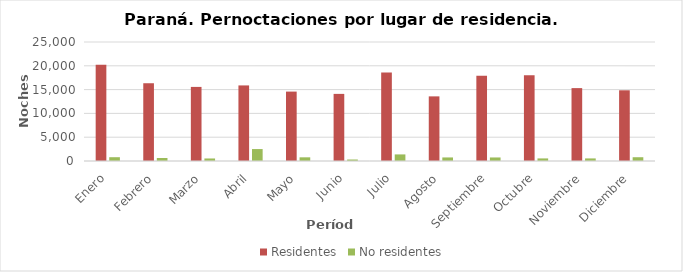
| Category | Residentes | No residentes |
|---|---|---|
| Enero | 20240 | 796 |
| Febrero | 16337 | 629 |
| Marzo | 15565 | 532 |
| Abril | 15878 | 2509 |
| Mayo | 14582 | 772 |
| Junio | 14100 | 312 |
| Julio | 18608 | 1384 |
| Agosto | 13578 | 748 |
| Septiembre | 17926 | 744 |
| Octubre | 18003 | 543 |
| Noviembre | 15313 | 543 |
| Diciembre | 14852 | 792 |